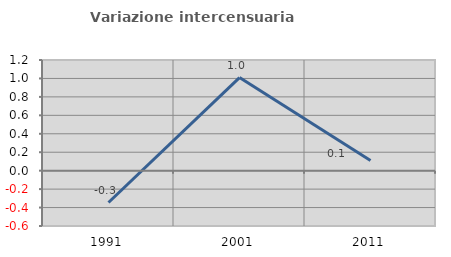
| Category | Variazione intercensuaria annua |
|---|---|
| 1991.0 | -0.345 |
| 2001.0 | 1.009 |
| 2011.0 | 0.111 |